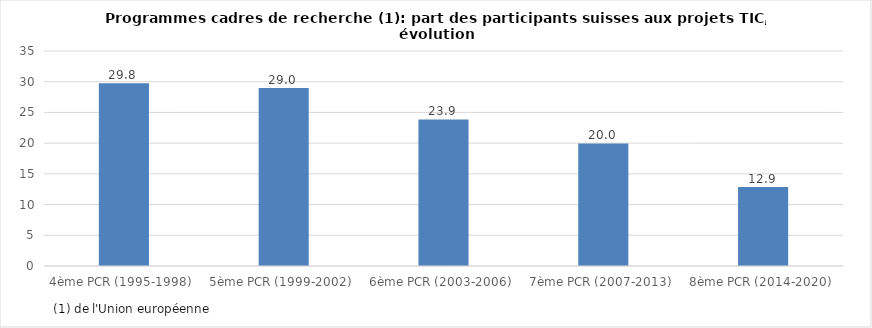
| Category | Series 0 |
|---|---|
| 4ème PCR (1995-1998)  | 29.759 |
| 5ème PCR (1999-2002)  | 28.988 |
| 6ème PCR (2003-2006)  | 23.852 |
| 7ème PCR (2007-2013)  | 19.958 |
| 8ème PCR (2014-2020)  | 12.873 |